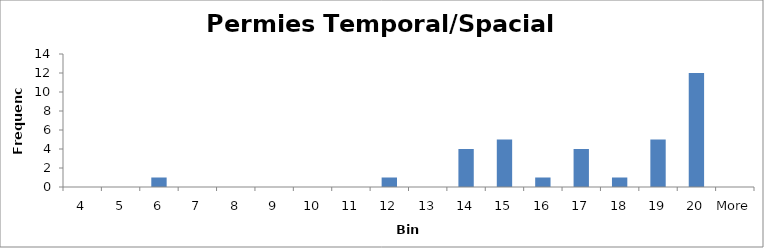
| Category | Frequency |
|---|---|
| 4 | 0 |
| 5 | 0 |
| 6 | 1 |
| 7 | 0 |
| 8 | 0 |
| 9 | 0 |
| 10 | 0 |
| 11 | 0 |
| 12 | 1 |
| 13 | 0 |
| 14 | 4 |
| 15 | 5 |
| 16 | 1 |
| 17 | 4 |
| 18 | 1 |
| 19 | 5 |
| 20 | 12 |
| More | 0 |